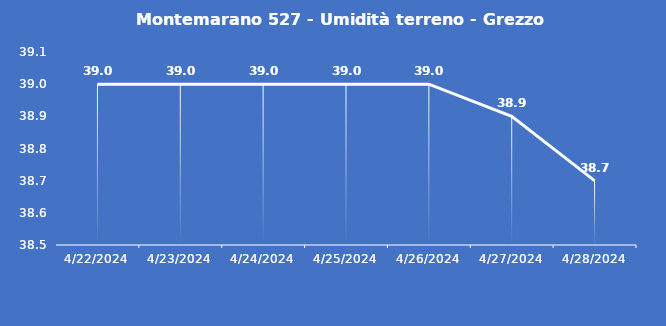
| Category | Montemarano 527 - Umidità terreno - Grezzo (%VWC) |
|---|---|
| 4/22/24 | 39 |
| 4/23/24 | 39 |
| 4/24/24 | 39 |
| 4/25/24 | 39 |
| 4/26/24 | 39 |
| 4/27/24 | 38.9 |
| 4/28/24 | 38.7 |